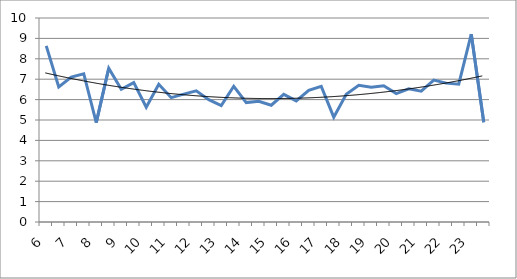
| Category | Series 0 |
|---|---|
| 6.0 | 8.634 |
| 6.5 | 6.623 |
| 7.0 | 7.1 |
| 7.5 | 7.267 |
| 8.0 | 4.867 |
| 8.5 | 7.536 |
| 9.0 | 6.503 |
| 9.5 | 6.834 |
| 10.0 | 5.625 |
| 10.5 | 6.748 |
| 11.0 | 6.094 |
| 11.5 | 6.269 |
| 12.0 | 6.429 |
| 12.5 | 5.993 |
| 13.0 | 5.708 |
| 13.5 | 6.655 |
| 14.0 | 5.855 |
| 14.5 | 5.917 |
| 15.0 | 5.723 |
| 15.5 | 6.256 |
| 16.0 | 5.935 |
| 16.5 | 6.454 |
| 17.0 | 6.65 |
| 17.5 | 5.14 |
| 18.0 | 6.264 |
| 18.5 | 6.701 |
| 19.0 | 6.604 |
| 19.5 | 6.678 |
| 20.0 | 6.294 |
| 20.5 | 6.528 |
| 21.0 | 6.413 |
| 21.5 | 6.953 |
| 22.0 | 6.808 |
| 22.5 | 6.754 |
| 23.0 | 9.209 |
| 23.5 | 4.887 |